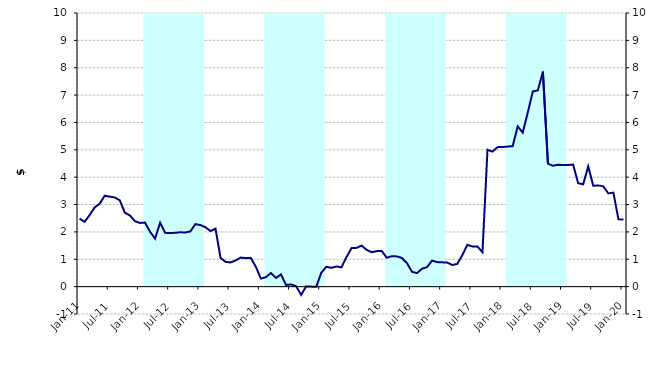
| Category | Series 1 |
|---|---|
| 0 | 0 |
| 1900-01-01 | 0 |
| 1900-01-02 | 0 |
| 1900-01-03 | 0 |
| 1900-01-04 | 0 |
| 1900-01-05 | 0 |
| 1900-01-06 | 0 |
| 1900-01-07 | 0 |
| 1900-01-08 | 0 |
| 1900-01-09 | 0 |
| 1900-01-10 | 0 |
| 1900-01-11 | 0 |
| 1900-01-12 | 0 |
| 1900-01-13 | 10000000 |
| 1900-01-14 | 10000000 |
| 1900-01-15 | 10000000 |
| 1900-01-16 | 10000000 |
| 1900-01-17 | 10000000 |
| 1900-01-18 | 10000000 |
| 1900-01-19 | 10000000 |
| 1900-01-20 | 10000000 |
| 1900-01-21 | 10000000 |
| 1900-01-22 | 10000000 |
| 1900-01-23 | 10000000 |
| 1900-01-24 | 10000000 |
| 1900-01-25 | 0 |
| 1900-01-26 | 0 |
| 1900-01-27 | 0 |
| 1900-01-28 | 0 |
| 1900-01-29 | 0 |
| 1900-01-30 | 0 |
| 1900-01-31 | 0 |
| 1900-02-01 | 0 |
| 1900-02-02 | 0 |
| 1900-02-03 | 0 |
| 1900-02-04 | 0 |
| 1900-02-05 | 0 |
| 1900-02-06 | 10000000 |
| 1900-02-07 | 10000000 |
| 1900-02-08 | 10000000 |
| 1900-02-09 | 10000000 |
| 1900-02-10 | 10000000 |
| 1900-02-11 | 10000000 |
| 1900-02-12 | 10000000 |
| 1900-02-13 | 10000000 |
| 1900-02-14 | 10000000 |
| 1900-02-15 | 10000000 |
| 1900-02-16 | 10000000 |
| 1900-02-17 | 10000000 |
| 1900-02-18 | 0 |
| 1900-02-19 | 0 |
| 1900-02-20 | 0 |
| 1900-02-21 | 0 |
| 1900-02-22 | 0 |
| 1900-02-23 | 0 |
| 1900-02-24 | 0 |
| 1900-02-25 | 0 |
| 1900-02-26 | 0 |
| 1900-02-27 | 0 |
| 1900-02-28 | 0 |
| 1900-02-28 | 0 |
| 1900-03-01 | 10000000 |
| 1900-03-02 | 10000000 |
| 1900-03-03 | 10000000 |
| 1900-03-04 | 10000000 |
| 1900-03-05 | 10000000 |
| 1900-03-06 | 10000000 |
| 1900-03-07 | 10000000 |
| 1900-03-08 | 10000000 |
| 1900-03-09 | 10000000 |
| 1900-03-10 | 10000000 |
| 1900-03-11 | 10000000 |
| 1900-03-12 | 10000000 |
| 1900-03-13 | 0 |
| 1900-03-14 | 0 |
| 1900-03-15 | 0 |
| 1900-03-16 | 0 |
| 1900-03-17 | 0 |
| 1900-03-18 | 0 |
| 1900-03-19 | 0 |
| 1900-03-20 | 0 |
| 1900-03-21 | 0 |
| 1900-03-22 | 0 |
| 1900-03-23 | 0 |
| 1900-03-24 | 0 |
| 1900-03-25 | 10000000 |
| 1900-03-26 | 10000000 |
| 1900-03-27 | 10000000 |
| 1900-03-28 | 10000000 |
| 1900-03-29 | 10000000 |
| 1900-03-30 | 10000000 |
| 1900-03-31 | 10000000 |
| 1900-04-01 | 10000000 |
| 1900-04-02 | 10000000 |
| 1900-04-03 | 10000000 |
| 1900-04-04 | 10000000 |
| 1900-04-05 | 10000000 |
| 1900-04-06 | 0 |
| 1900-04-07 | 0 |
| 1900-04-08 | 0 |
| 1900-04-09 | 0 |
| 1900-04-10 | 0 |
| 1900-04-11 | 0 |
| 1900-04-12 | 0 |
| 1900-04-13 | 0 |
| 1900-04-14 | 0 |
| 1900-04-15 | 0 |
| 1900-04-16 | 0 |
| 1900-04-17 | 0 |